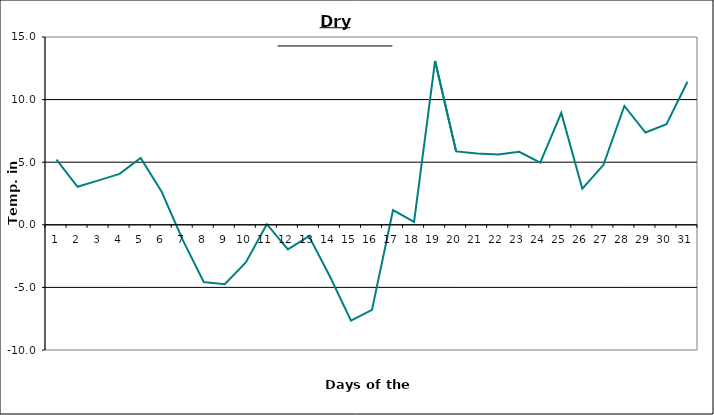
| Category | Series 0 |
|---|---|
| 0 | 5.2 |
| 1 | 3.04 |
| 2 | 3.55 |
| 3 | 4.07 |
| 4 | 5.33 |
| 5 | 2.64 |
| 6 | -1.21 |
| 7 | -4.57 |
| 8 | -4.75 |
| 9 | -3 |
| 10 | 0.05 |
| 11 | -1.97 |
| 12 | -0.9 |
| 13 | -4.13 |
| 14 | -7.66 |
| 15 | -6.79 |
| 16 | 1.17 |
| 17 | 0.23 |
| 18 | 13.09 |
| 19 | 5.86 |
| 20 | 5.69 |
| 21 | 5.62 |
| 22 | 5.83 |
| 23 | 4.97 |
| 24 | 8.94 |
| 25 | 2.88 |
| 26 | 4.77 |
| 27 | 9.49 |
| 28 | 7.37 |
| 29 | 8.04 |
| 30 | 11.43 |